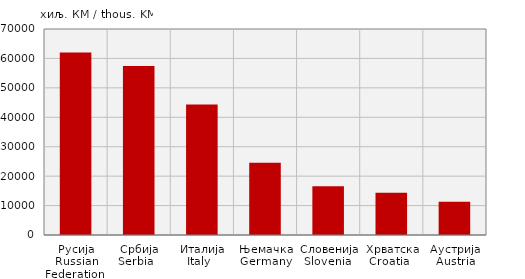
| Category | Увоз
Import |
|---|---|
| Русија
Russian Federation  | 62057 |
| Србија
Serbia   | 57394 |
| Италија
Italy   | 44349 |
| Њемачка
Germany | 24551 |
| Словенија
Slovenia  | 16586 |
| Хрватска
Croatia   | 14358 |
| Аустрија
Austria | 11265 |